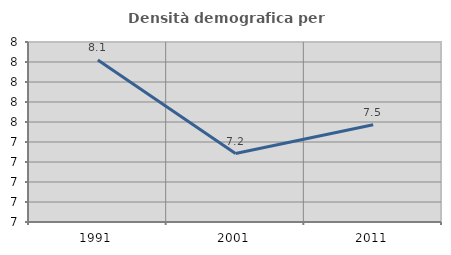
| Category | Densità demografica |
|---|---|
| 1991.0 | 8.119 |
| 2001.0 | 7.185 |
| 2011.0 | 7.472 |